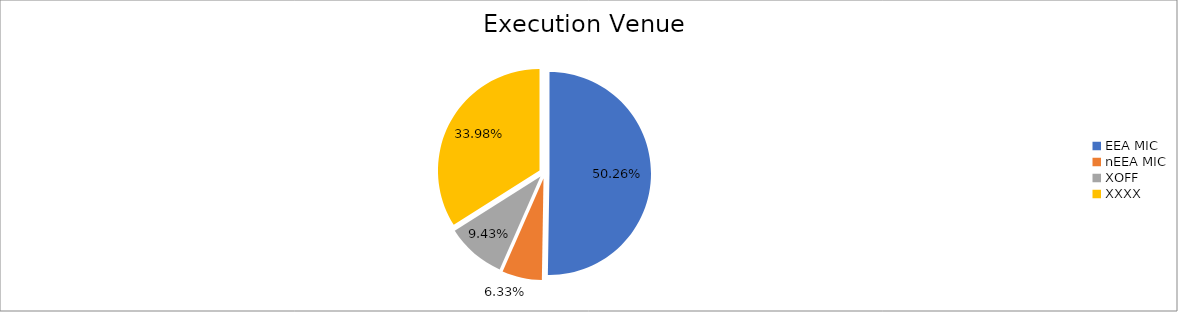
| Category | Series 0 |
|---|---|
| EEA MIC | 6212867.134 |
| nEEA MIC | 782788.974 |
| XOFF | 1165114.7 |
| XXXX | 4200839.326 |